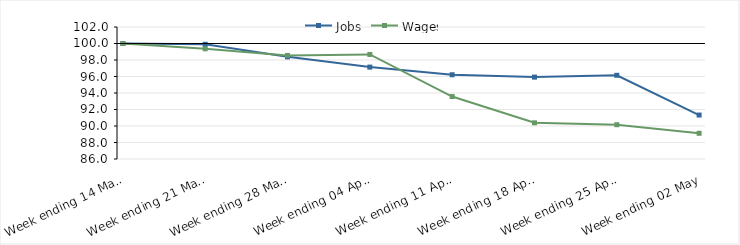
| Category | Jobs | Wages |
|---|---|---|
| 2020-03-14 | 100 | 100 |
| 2020-03-21 | 99.902 | 99.358 |
| 2020-03-28 | 98.381 | 98.553 |
| 2020-04-04 | 97.139 | 98.673 |
| 2020-04-11 | 96.21 | 93.572 |
| 2020-04-18 | 95.925 | 90.386 |
| 2020-04-25 | 96.147 | 90.156 |
| 2020-05-02 | 91.328 | 89.116 |